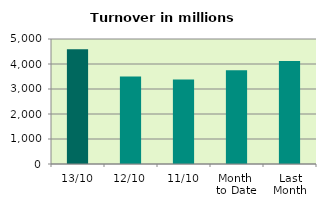
| Category | Series 0 |
|---|---|
| 13/10 | 4588.275 |
| 12/10 | 3500.881 |
| 11/10 | 3382.676 |
| Month 
to Date | 3750.268 |
| Last
Month | 4119.728 |